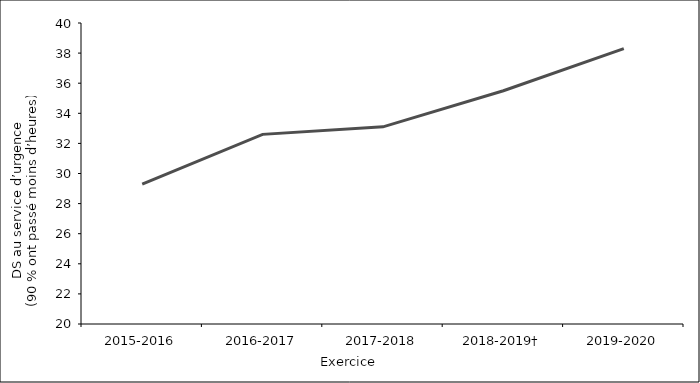
| Category | Series 0 |
|---|---|
| 2015-2016 | 29.3 |
| 2016-2017 | 32.6 |
| 2017-2018 | 33.1 |
| 2018-2019† | 35.5 |
| 2019-2020 | 38.3 |